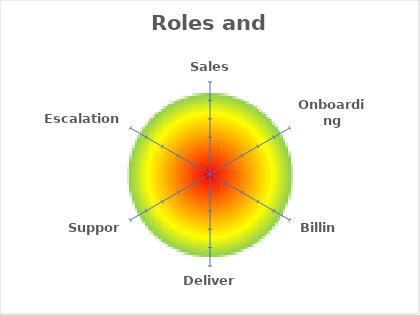
| Category | Roles and resources |
|---|---|
| Sales | 0 |
| Onboarding | 0 |
| Billing | 0 |
| Delivery | 0 |
| Support | 0 |
| Escalations | 0 |